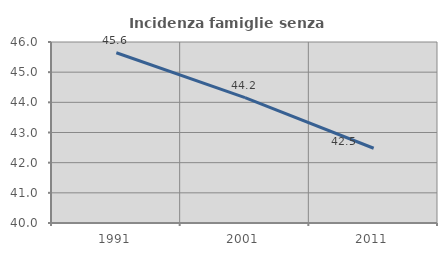
| Category | Incidenza famiglie senza nuclei |
|---|---|
| 1991.0 | 45.645 |
| 2001.0 | 44.156 |
| 2011.0 | 42.478 |